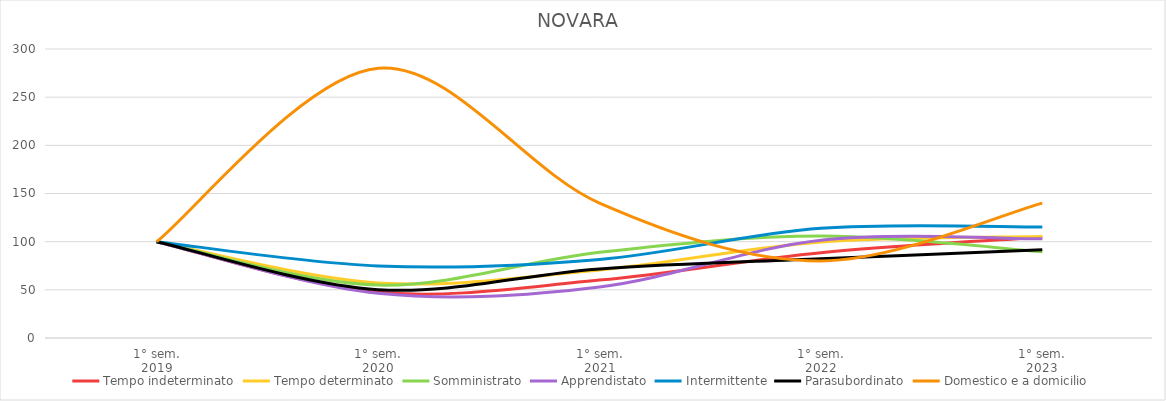
| Category | Tempo indeterminato | Tempo determinato | Somministrato | Apprendistato | Intermittente | Parasubordinato | Domestico e a domicilio |
|---|---|---|---|---|---|---|---|
| 1° sem.
2019 | 100 | 100 | 100 | 100 | 100 | 100 | 100 |
| 1° sem.
2020 | 47.409 | 57.168 | 54.945 | 46.386 | 74.791 | 50.146 | 280 |
| 1° sem.
2021 | 60.104 | 70.68 | 89.011 | 53.012 | 81.59 | 71.72 | 140 |
| 1° sem.
2022 | 88.601 | 99.654 | 105.769 | 101.506 | 113.912 | 82.216 | 80 |
| 1° sem.
2023 | 104.663 | 105.37 | 89.56 | 103.012 | 115.272 | 91.545 | 140 |